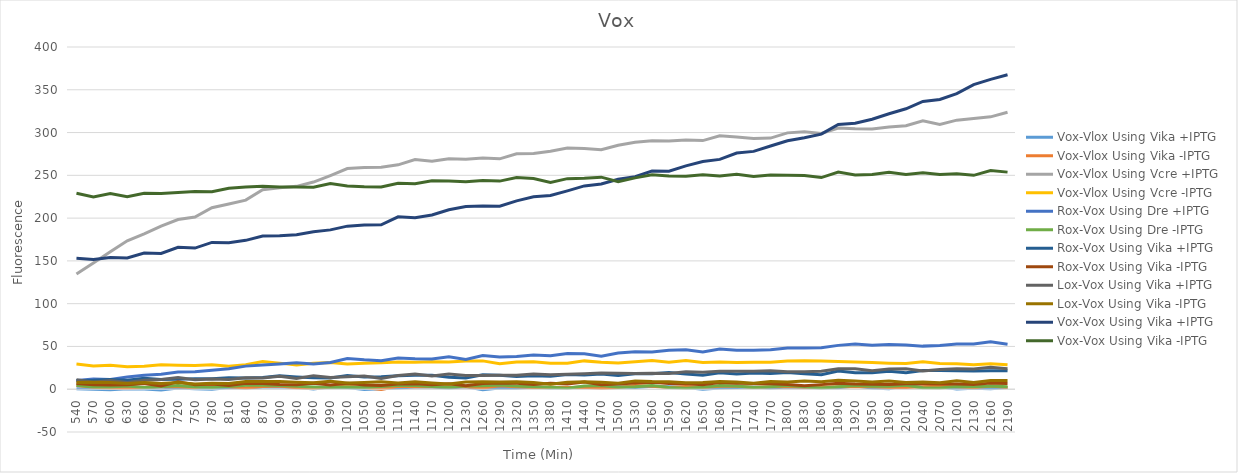
| Category | Vox-Vlox Using Vika +IPTG | Vox-Vlox Using Vika -IPTG | Vox-Vlox Using Vcre +IPTG | Vox-Vlox Using Vcre -IPTG | Rox-Vox Using Dre +IPTG | Rox-Vox Using Dre -IPTG | Rox-Vox Using Vika +IPTG | Rox-Vox Using Vika -IPTG | Lox-Vox Using Vika +IPTG | Lox-Vox Using Vika -IPTG | Vox-Vox Using Vika +IPTG | Vox-Vox Using Vika -IPTG |
|---|---|---|---|---|---|---|---|---|---|---|---|---|
| 540.0 | 0.5 | 4.25 | 134.75 | 29.5 | 10.25 | 4.5 | 10.25 | 6.75 | 11 | 8 | 153 | 229 |
| 570.0 | 0 | 2.25 | 147.5 | 27.25 | 12 | 2.5 | 10.5 | 5.25 | 8.25 | 8.25 | 151.75 | 224.75 |
| 600.0 | -0.75 | 1 | 160.75 | 28 | 11.5 | 2.5 | 11.5 | 5 | 10.25 | 7.75 | 154 | 228.75 |
| 630.0 | 0.5 | 1.25 | 173.5 | 26.25 | 14.25 | 3.75 | 10.5 | 5.25 | 7.75 | 6.75 | 153.5 | 225 |
| 660.0 | 0.125 | 2.125 | 181.625 | 26.875 | 16.375 | 1.875 | 12.875 | 6.625 | 10.625 | 7.875 | 159.125 | 229.125 |
| 690.0 | -1 | 3.25 | 190.75 | 28.5 | 17.5 | 2.75 | 11.25 | 3.75 | 11.5 | 6.75 | 158.75 | 228.75 |
| 720.0 | 1.375 | 2.875 | 198.375 | 28.125 | 20.125 | 4.375 | 11.625 | 8.625 | 13.625 | 7.875 | 165.875 | 229.875 |
| 750.0 | 0.5 | 1.75 | 201.25 | 27.75 | 20.5 | 2.5 | 12.25 | 5.25 | 11 | 6.25 | 165 | 231 |
| 780.0 | -0.125 | 4.375 | 212.125 | 28.625 | 22.125 | 1.875 | 12.375 | 6.125 | 11.875 | 6.875 | 171.625 | 230.875 |
| 810.0 | 2 | 3 | 216.5 | 27 | 24 | 3.25 | 13.5 | 4.25 | 11.25 | 6.75 | 171.25 | 235 |
| 840.0 | 1.5 | 1.5 | 221 | 28.75 | 27 | 4.75 | 13.25 | 7 | 13.5 | 9 | 174 | 236.25 |
| 870.0 | 2.5 | 3.25 | 233.25 | 32.25 | 28.25 | 4.5 | 13.75 | 6.75 | 13.25 | 9 | 179 | 237.25 |
| 900.0 | 2.5 | 3.75 | 235.5 | 30.5 | 29.5 | 4.25 | 15.75 | 5.5 | 15.25 | 9 | 179.25 | 236.5 |
| 930.0 | 2.375 | 1.625 | 237.125 | 28.375 | 30.875 | 3.375 | 14.375 | 5.125 | 12.625 | 8.125 | 180.625 | 236.375 |
| 960.0 | 0.375 | 0.875 | 242.125 | 30.375 | 29.625 | 2.625 | 13.375 | 6.875 | 15.875 | 7.625 | 184.125 | 236.125 |
| 990.0 | 2.5 | 2.5 | 249.75 | 31.25 | 31.25 | 2.25 | 13.25 | 5 | 13.75 | 9.25 | 186.25 | 240.5 |
| 1020.0 | 1.875 | 3.375 | 257.875 | 29.625 | 35.875 | 2.625 | 16.125 | 6.875 | 14.625 | 7.375 | 190.625 | 237.625 |
| 1050.0 | -0.375 | 1.875 | 259.125 | 30.375 | 34.375 | 1.875 | 14.375 | 4.875 | 15.375 | 7.875 | 191.875 | 236.625 |
| 1080.0 | 0.625 | -0.375 | 259.375 | 30.875 | 33.375 | 3.125 | 14.625 | 4.375 | 12.625 | 8.625 | 192.125 | 236.375 |
| 1110.0 | 1.5 | 3.5 | 262.25 | 31.75 | 36.5 | 4.5 | 15.75 | 6 | 16 | 7.25 | 201.5 | 240.75 |
| 1140.0 | 2.5 | 2.75 | 268.5 | 31.5 | 35.5 | 4.25 | 16.25 | 6.5 | 17.75 | 8.75 | 200.5 | 240.25 |
| 1170.0 | 2.625 | 2.875 | 266.375 | 32.125 | 35.375 | 3.125 | 16.375 | 5.125 | 15.375 | 7.375 | 203.625 | 243.625 |
| 1200.0 | 1.5 | 2.75 | 269.5 | 31.75 | 38 | 2.25 | 14 | 6.25 | 17.75 | 6.25 | 209.75 | 243.5 |
| 1230.0 | 2.875 | 2.875 | 268.875 | 32.875 | 34.875 | 3.875 | 13.125 | 4.125 | 16.125 | 8.375 | 213.625 | 242.625 |
| 1260.0 | -0.625 | 1.375 | 270.125 | 33.125 | 39.375 | 4.125 | 16.875 | 6.625 | 16.125 | 8.875 | 214.125 | 243.875 |
| 1290.0 | 1.5 | 4 | 269.25 | 29.75 | 37.75 | 5 | 16.25 | 7.25 | 16.25 | 8.5 | 214 | 243.25 |
| 1320.0 | 1.125 | 2.875 | 275.125 | 31.875 | 38.375 | 3.625 | 14.875 | 6.875 | 16.375 | 8.625 | 220.125 | 247.375 |
| 1350.0 | 2.625 | 1.875 | 275.625 | 32.125 | 40.125 | 2.875 | 15.625 | 5.625 | 17.875 | 7.875 | 224.875 | 246.375 |
| 1380.0 | 1.5 | 2.25 | 278.25 | 30.25 | 39 | 2.25 | 15.25 | 7 | 17 | 5.75 | 226.5 | 241.75 |
| 1410.0 | 1.625 | 2.125 | 281.875 | 30.375 | 41.875 | 1.125 | 17.125 | 6.125 | 17.625 | 8.125 | 231.875 | 246.125 |
| 1440.0 | 2.625 | 2.375 | 281.375 | 33.125 | 41.375 | 3.875 | 16.625 | 8.375 | 18.125 | 8.875 | 237.625 | 246.625 |
| 1470.0 | 2.125 | 0.875 | 279.875 | 31.625 | 38.625 | 4.375 | 17.875 | 5.125 | 18.875 | 8.125 | 239.875 | 247.875 |
| 1500.0 | 2.875 | 2.125 | 285.125 | 30.625 | 42.375 | 2.375 | 16.125 | 6.125 | 18.625 | 6.875 | 245.375 | 242.625 |
| 1530.0 | 2 | 4.25 | 288.75 | 32 | 43.75 | 3 | 18 | 7.25 | 18.5 | 9.75 | 248.5 | 247 |
| 1560.0 | 3.5 | 3.5 | 290.5 | 33.5 | 43.5 | 4.25 | 18 | 8.25 | 18.75 | 9 | 255 | 250.75 |
| 1590.0 | 2.875 | 2.125 | 290.125 | 31.625 | 45.625 | 2.125 | 19.625 | 6.625 | 18.375 | 8.875 | 254.875 | 249.125 |
| 1620.0 | 2 | 3.25 | 291.25 | 33.5 | 46 | 1.25 | 17.75 | 6.5 | 20.5 | 7.5 | 261 | 249 |
| 1650.0 | -0.125 | 1.875 | 290.625 | 31.125 | 43.625 | 2.375 | 16.375 | 5.375 | 19.875 | 7.875 | 266.125 | 250.625 |
| 1680.0 | 1.375 | 3.375 | 296.125 | 31.875 | 47.125 | 4.375 | 19.125 | 7.875 | 21.125 | 9.125 | 268.625 | 249.125 |
| 1710.0 | 2.125 | 3.375 | 294.875 | 31.125 | 45.625 | 3.875 | 17.875 | 6.875 | 20.875 | 8.375 | 276.125 | 251.125 |
| 1740.0 | 2.5 | 2.25 | 293 | 31.5 | 45.5 | 2 | 19 | 6.75 | 21 | 7 | 278 | 248.75 |
| 1770.0 | 1.5 | 3 | 293.5 | 31.5 | 46.25 | 3 | 18.5 | 6.25 | 21.5 | 9 | 284.25 | 250.25 |
| 1800.0 | 2.625 | 3.125 | 299.625 | 32.875 | 48.125 | 4.375 | 19.625 | 5.625 | 20.375 | 8.375 | 290.375 | 250.125 |
| 1830.0 | 2 | 2.25 | 301 | 33.25 | 48.25 | 3 | 18 | 4 | 20.5 | 9.75 | 294 | 249.75 |
| 1860.0 | 1.625 | 2.375 | 298.875 | 32.875 | 48.375 | 1.375 | 16.875 | 5.375 | 21.125 | 8.625 | 298.125 | 247.375 |
| 1890.0 | 1.75 | 2.75 | 305.25 | 32.5 | 51.25 | 2.75 | 21.25 | 7 | 24 | 10.5 | 309.5 | 253.75 |
| 1920.0 | 3.875 | 2.875 | 304.375 | 31.875 | 52.875 | 4.375 | 19.125 | 6.125 | 23.875 | 9.625 | 310.875 | 250.375 |
| 1950.0 | 1.375 | 2.875 | 304.125 | 31.375 | 51.375 | 3.375 | 19.125 | 5.875 | 21.625 | 8.375 | 315.625 | 250.875 |
| 1980.0 | 0.5 | 2 | 306.5 | 30.5 | 52.25 | 3.5 | 21 | 5.5 | 23.75 | 9.5 | 322 | 253.5 |
| 2010.0 | 4.5 | 2 | 308 | 30 | 51.75 | 4.75 | 19.25 | 6.5 | 24 | 8 | 327.75 | 251 |
| 2040.0 | 2.125 | 2.875 | 313.625 | 32.125 | 50.375 | 1.625 | 21.875 | 6.375 | 21.375 | 8.375 | 336.375 | 253.125 |
| 2070.0 | 2.875 | 3.375 | 309.375 | 30.125 | 51.125 | 1.375 | 21.875 | 6.125 | 23.125 | 7.625 | 338.625 | 250.875 |
| 2100.0 | 0.25 | 2.75 | 314.5 | 29.75 | 52.75 | 3.25 | 21.5 | 6 | 24 | 10 | 345.5 | 251.75 |
| 2130.0 | 1 | 1.75 | 316.5 | 28.75 | 52.75 | 2.75 | 21.25 | 5.5 | 23.75 | 8 | 356 | 250 |
| 2160.0 | 0.625 | 3.625 | 318.375 | 29.875 | 55.375 | 3.625 | 21.625 | 7.125 | 25.625 | 10.125 | 362.125 | 255.625 |
| 2190.0 | 2 | 2 | 323.75 | 28.5 | 52.5 | 2.75 | 21.5 | 6.75 | 24 | 10.25 | 367.5 | 253.75 |